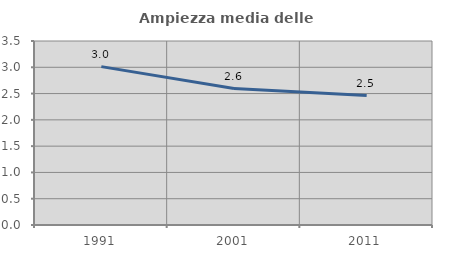
| Category | Ampiezza media delle famiglie |
|---|---|
| 1991.0 | 3.012 |
| 2001.0 | 2.596 |
| 2011.0 | 2.462 |